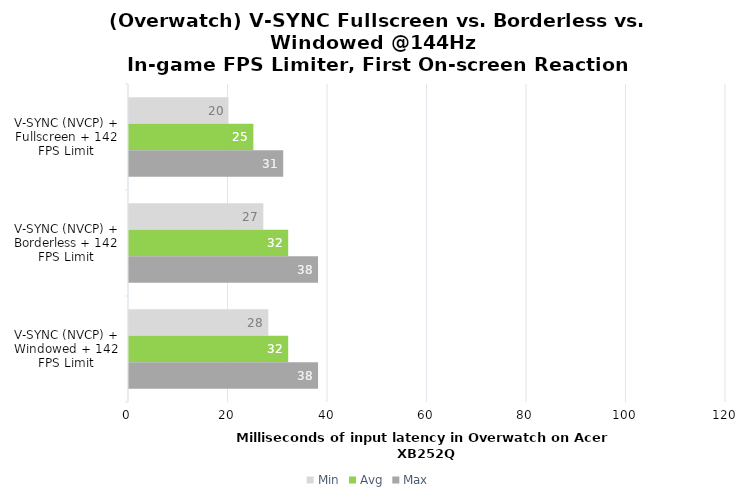
| Category | Min | Avg | Max |
|---|---|---|---|
| V-SYNC (NVCP) + Fullscreen + 142 FPS Limit | 20 | 25 | 31 |
| V-SYNC (NVCP) + Borderless + 142 FPS Limit | 27 | 32 | 38 |
| V-SYNC (NVCP) + Windowed + 142 FPS Limit | 28 | 32 | 38 |